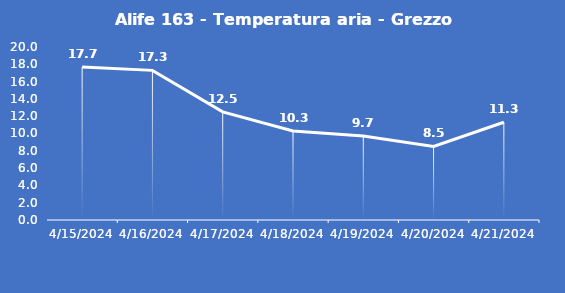
| Category | Alife 163 - Temperatura aria - Grezzo (°C) |
|---|---|
| 4/15/24 | 17.7 |
| 4/16/24 | 17.3 |
| 4/17/24 | 12.5 |
| 4/18/24 | 10.3 |
| 4/19/24 | 9.7 |
| 4/20/24 | 8.5 |
| 4/21/24 | 11.3 |